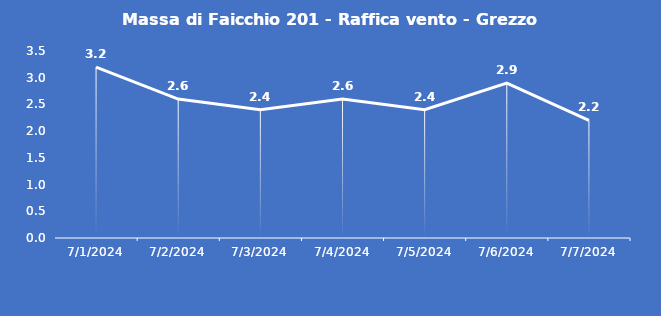
| Category | Massa di Faicchio 201 - Raffica vento - Grezzo (m/s) |
|---|---|
| 7/1/24 | 3.2 |
| 7/2/24 | 2.6 |
| 7/3/24 | 2.4 |
| 7/4/24 | 2.6 |
| 7/5/24 | 2.4 |
| 7/6/24 | 2.9 |
| 7/7/24 | 2.2 |